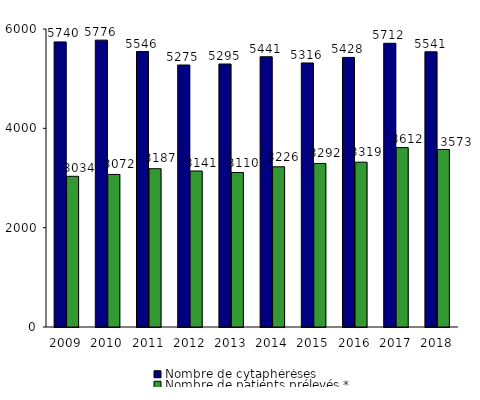
| Category | Nombre de cytaphérèses | Nombre de patients prélevés * |
|---|---|---|
| 2009.0 | 5740 | 3034 |
| 2010.0 | 5776 | 3072 |
| 2011.0 | 5546 | 3187 |
| 2012.0 | 5275 | 3141 |
| 2013.0 | 5295 | 3110 |
| 2014.0 | 5441 | 3226 |
| 2015.0 | 5316 | 3292 |
| 2016.0 | 5428 | 3319 |
| 2017.0 | 5712 | 3612 |
| 2018.0 | 5541 | 3573 |